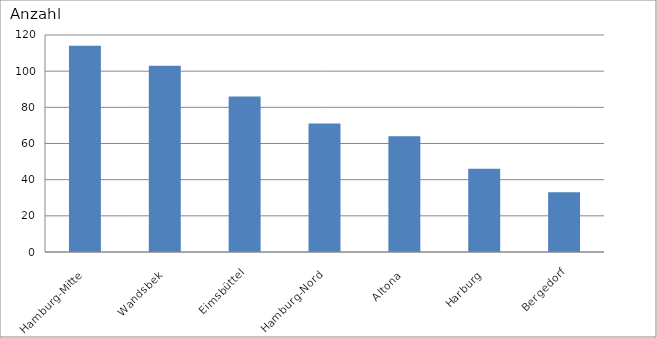
| Category | Hamburg-Mitte Wandsbek Eimsbüttel Hamburg-Nord Altona Harburg Bergedorf |
|---|---|
| Hamburg-Mitte | 114 |
| Wandsbek | 103 |
| Eimsbüttel | 86 |
| Hamburg-Nord | 71 |
| Altona | 64 |
| Harburg | 46 |
| Bergedorf | 33 |